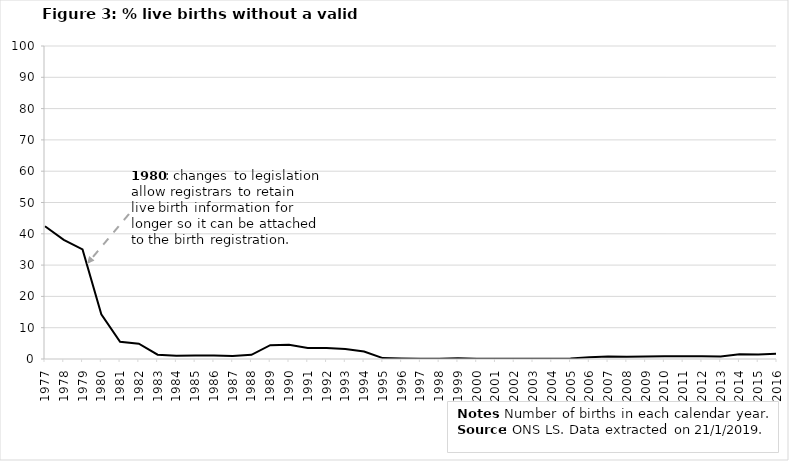
| Category | Series 0 |
|---|---|
| 1977.0 | 42.42 |
| 1978.0 | 38.08 |
| 1979.0 | 35.03 |
| 1980.0 | 14.29 |
| 1981.0 | 5.49 |
| 1982.0 | 4.89 |
| 1983.0 | 1.39 |
| 1984.0 | 1.05 |
| 1985.0 | 1.09 |
| 1986.0 | 1.1 |
| 1987.0 | 0.94 |
| 1988.0 | 1.34 |
| 1989.0 | 4.4 |
| 1990.0 | 4.56 |
| 1991.0 | 3.54 |
| 1992.0 | 3.5 |
| 1993.0 | 3.17 |
| 1994.0 | 2.37 |
| 1995.0 | 0.29 |
| 1996.0 | 0.14 |
| 1997.0 | 0.09 |
| 1998.0 | 0.09 |
| 1999.0 | 0.21 |
| 2000.0 | 0.08 |
| 2001.0 | 0.04 |
| 2002.0 | 0.07 |
| 2003.0 | 0.06 |
| 2004.0 | 0.1 |
| 2005.0 | 0.19 |
| 2006.0 | 0.58 |
| 2007.0 | 0.8 |
| 2008.0 | 0.7 |
| 2009.0 | 0.8 |
| 2010.0 | 0.9 |
| 2011.0 | 0.9 |
| 2012.0 | 0.9 |
| 2013.0 | 0.8 |
| 2014.0 | 1.5 |
| 2015.0 | 1.4 |
| 2016.0 | 1.7 |